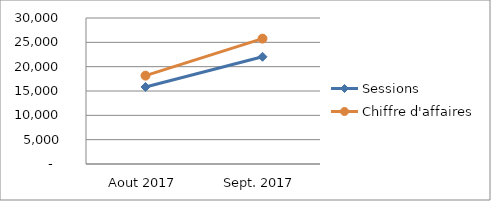
| Category | Sessions | Chiffre d'affaires |
|---|---|---|
| Aout 2017 | 15827 | 18156 |
| Sept. 2017 | 22033 | 25760 |